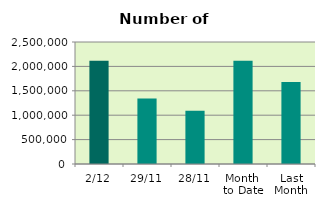
| Category | Series 0 |
|---|---|
| 2/12 | 2114964 |
| 29/11 | 1339764 |
| 28/11 | 1092232 |
| Month 
to Date | 2114964 |
| Last
Month | 1681386.857 |